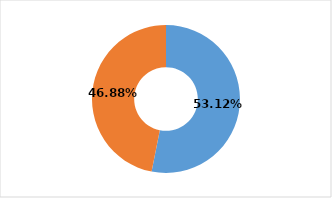
| Category | Series 0 |
|---|---|
| MUJERES | 0.531 |
| HOMBRES | 0.469 |